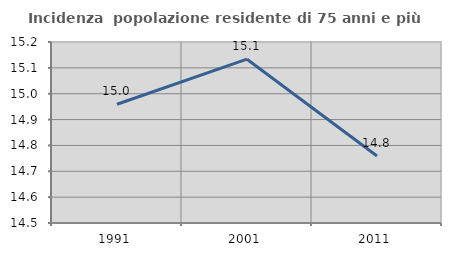
| Category | Incidenza  popolazione residente di 75 anni e più |
|---|---|
| 1991.0 | 14.959 |
| 2001.0 | 15.134 |
| 2011.0 | 14.759 |